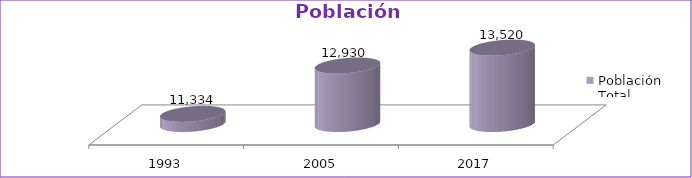
| Category | Población Total |
|---|---|
| 1993 | 11334 |
| 2005 | 12930 |
| 2017 | 13520 |